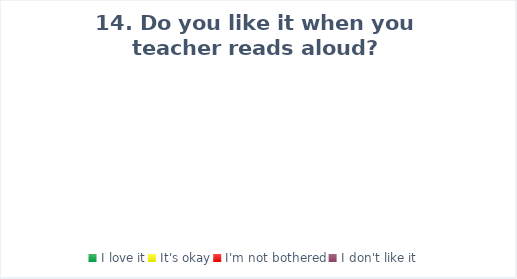
| Category | Series 0 |
|---|---|
| I love it | 0 |
| It's okay | 0 |
| I'm not bothered | 0 |
| I don't like it | 0 |